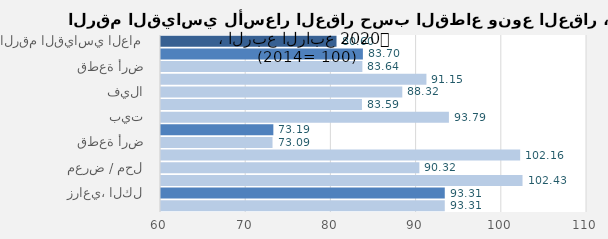
| Category | 2020 |
|---|---|
| الرقم القياسي العام | 80.6 |
| سكني، الكل | 83.696 |
| قطعة أرض | 83.636 |
| عمارة | 91.154 |
| فيلا | 88.321 |
| شقة | 83.585 |
| بيت | 93.793 |
| تجاري، الكل | 73.187 |
| قطعة أرض | 73.09 |
| عمارة | 102.156 |
| معرض / محل | 90.324 |
| مركز تجاري | 102.432 |
| زراعي، الكل | 93.307 |
| ارض زراعية | 93.307 |